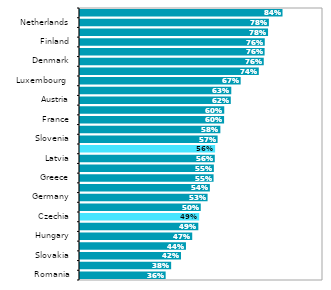
| Category | Series 0 |
|---|---|
| Romania | 0.357 |
| Bulgaria | 0.379 |
| Slovakia | 0.42 |
| Poland | 0.44 |
| Hungary | 0.466 |
| Estonia | 0.491 |
| Czechia | 0.495 |
| Croatia | 0.501 |
| Germany | 0.529 |
| Italy | 0.539 |
| Greece | 0.554 |
| Lithuania | 0.555 |
| Latvia | 0.559 |
| EU27 | 0.56 |
| Slovenia | 0.57 |
| Portugal | 0.582 |
| France | 0.597 |
| Spain | 0.598 |
| Austria | 0.625 |
| Ireland | 0.627 |
| Luxembourg  | 0.665 |
| Belgium | 0.74 |
| Denmark | 0.76 |
| Cyprus | 0.764 |
| Finland | 0.764 |
| Sweden | 0.778 |
| Netherlands | 0.781 |
| Malta | 0.838 |